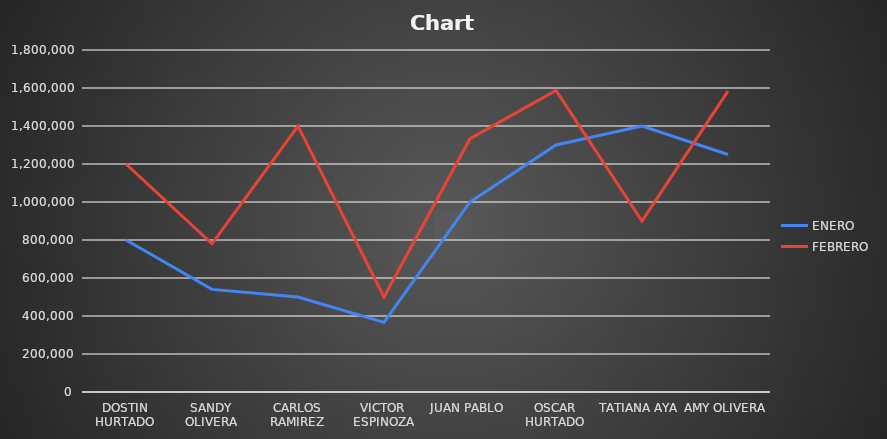
| Category | ENERO | FEBRERO |
|---|---|---|
| DOSTIN HURTADO | 800000 | 1200000 |
| SANDY OLIVERA | 540000 | 780000 |
| CARLOS RAMIREZ | 500000 | 1400000 |
| VICTOR ESPINOZA | 366666.667 | 500000 |
| JUAN PABLO | 1000000 | 1333333.333 |
| OSCAR HURTADO | 1300000 | 1586666.667 |
| TATIANA AYA | 1400000 | 900000 |
| AMY OLIVERA | 1250000 | 1583333.333 |